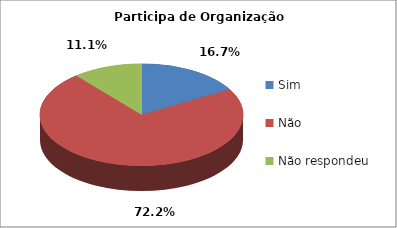
| Category | Series 0 |
|---|---|
| Sim | 6 |
| Não | 26 |
| Não respondeu | 4 |